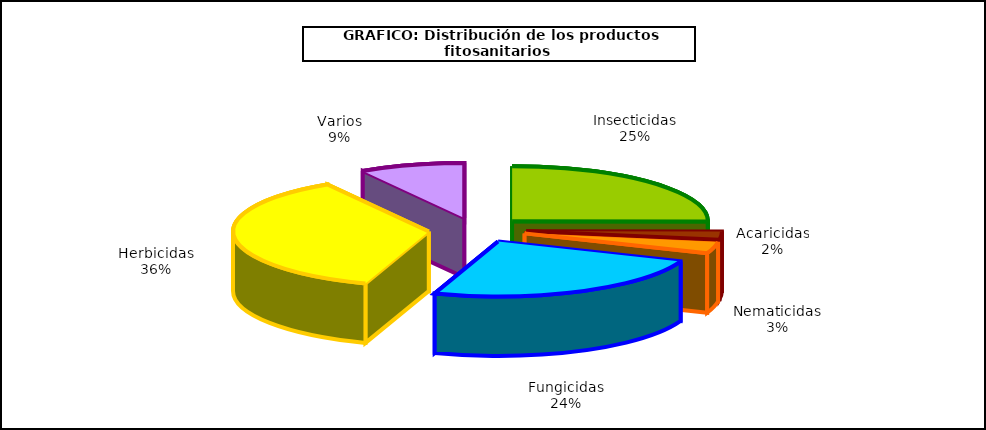
| Category | Insecticidas Acaricidas Nematicidas Fungicidas Herbicidas Varios |
|---|---|
| Insecticidas | 238.983 |
| Acaricidas | 22.442 |
| Nematicidas | 32.442 |
| Fungicidas | 231.812 |
| Herbicidas | 343.381 |
| Varios | 82.509 |